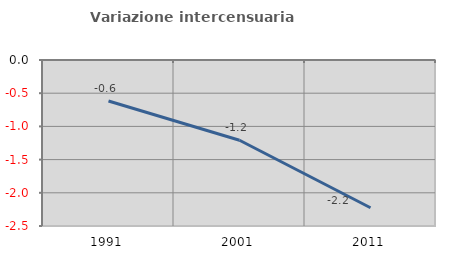
| Category | Variazione intercensuaria annua |
|---|---|
| 1991.0 | -0.618 |
| 2001.0 | -1.208 |
| 2011.0 | -2.225 |